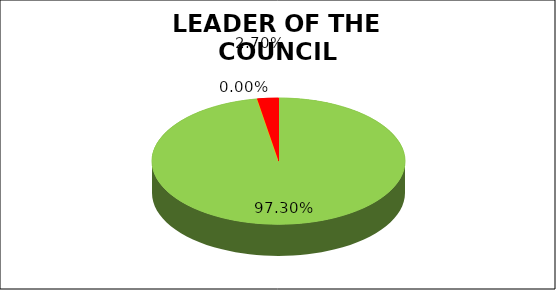
| Category | Q4 |
|---|---|
| Green | 0.973 |
| Amber | 0 |
| Red | 0.027 |